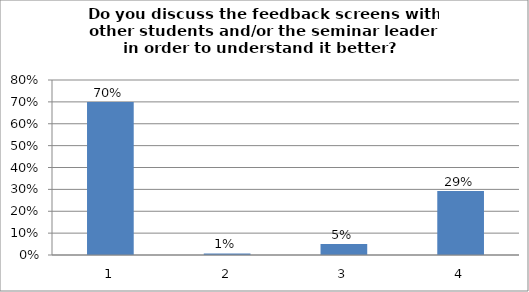
| Category | Series 0 |
|---|---|
| 0 | 0.7 |
| 1 | 0.007 |
| 2 | 0.05 |
| 3 | 0.293 |